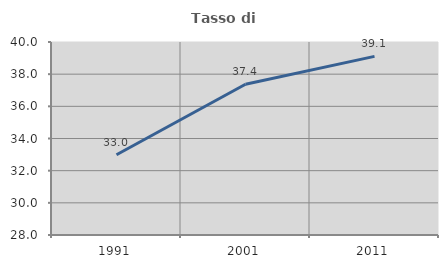
| Category | Tasso di occupazione   |
|---|---|
| 1991.0 | 32.986 |
| 2001.0 | 37.376 |
| 2011.0 | 39.107 |